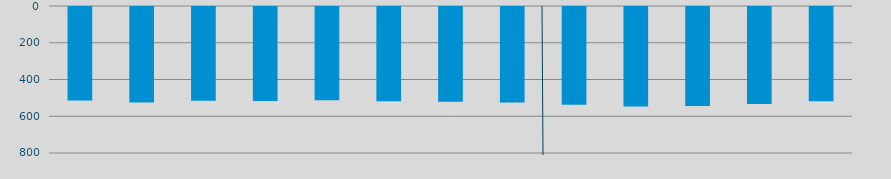
| Category | Energía a bajar | Energía a subir |
|---|---|---|
| M | 508.805 |  |
| J | 519.464 |  |
| J | 510.745 |  |
| A | 512.124 |  |
| S | 507.342 |  |
| O | 513.588 |  |
| N | 515.549 |  |
| D | 519.921 |  |
| E | 531.331 |  |
| F | 542.024 |  |
| M | 539.136 |  |
| A | 527.758 |  |
| M | 513.52 |  |